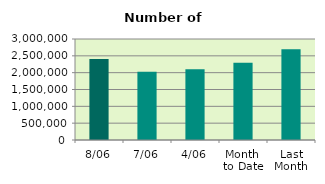
| Category | Series 0 |
|---|---|
| 8/06 | 2405894 |
| 7/06 | 2024574 |
| 4/06 | 2100736 |
| Month 
to Date | 2292213.333 |
| Last
Month | 2692139.333 |